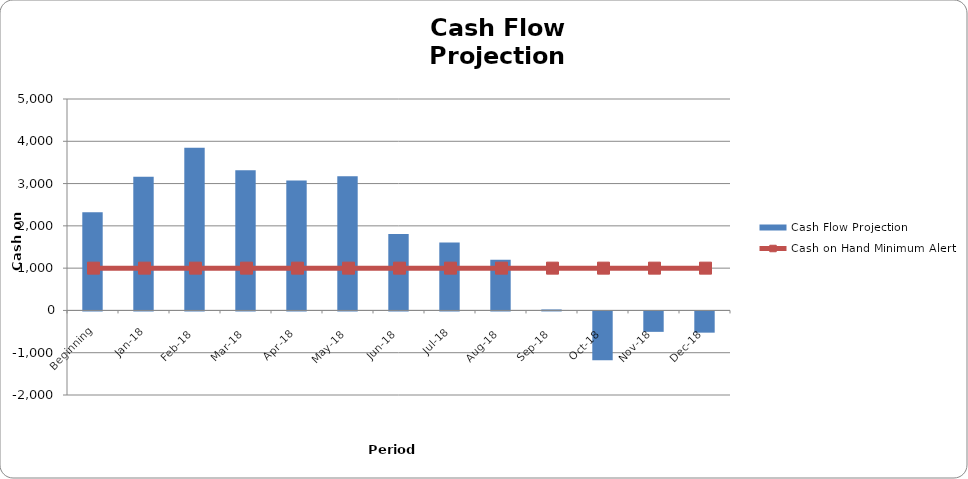
| Category | Cash Flow Projection |
|---|---|
| Beginning | 2320 |
| Jan-18 | 3159 |
| Feb-18 | 3850 |
| Mar-18 | 3313 |
| Apr-18 | 3073 |
| May-18 | 3176 |
| Jun-18 | 1808 |
| Jul-18 | 1607 |
| Aug-18 | 1198 |
| Sep-18 | 23 |
| Oct-18 | -1153 |
| Nov-18 | -483 |
| Dec-18 | -502 |